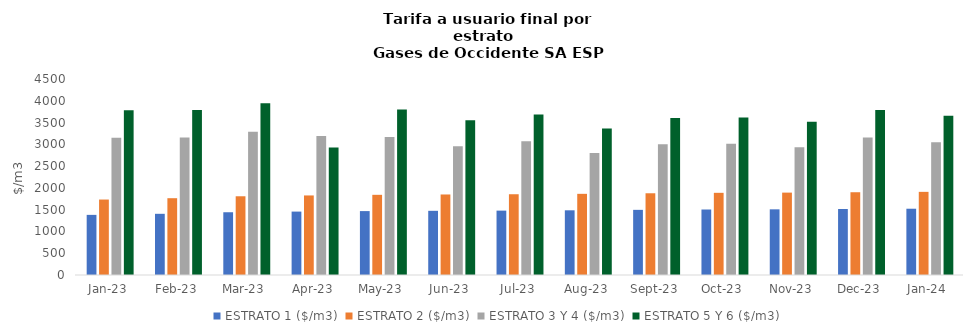
| Category | ESTRATO 1 ($/m3) | ESTRATO 2 ($/m3) | ESTRATO 3 Y 4 ($/m3) | ESTRATO 5 Y 6 ($/m3) |
|---|---|---|---|---|
| 2023-01-01 | 1380.44 | 1732.41 | 3153.94 | 3784.728 |
| 2023-02-01 | 1405.01 | 1763.25 | 3155.49 | 3786.588 |
| 2023-03-01 | 1440.79 | 1807.57 | 3288.4 | 3946.08 |
| 2023-04-01 | 1455.91 | 1826.55 | 3194.1 | 2929.63 |
| 2023-05-01 | 1467.27 | 1840.8 | 3166.38 | 3799.656 |
| 2023-06-01 | 1473.58 | 1848.72 | 2958.7 | 3550.44 |
| 2023-07-01 | 1478 | 1854.26 | 3071.96 | 3686.352 |
| 2023-08-01 | 1485.39 | 1863.53 | 2800.92 | 3361.104 |
| 2023-09-01 | 1495.79 | 1876.58 | 3003.77 | 3604.524 |
| 2023-10-01 | 1503.86 | 1886.71 | 3011.88 | 3614.256 |
| 2023-11-01 | 1507.62 | 1891.43 | 2933.28 | 3519.936 |
| 2023-12-01 | 1514.69 | 1900.29 | 3156.1 | 3787.32 |
| 2024-01-01 | 1521.53 | 1908.87 | 3048.21 | 3657.852 |